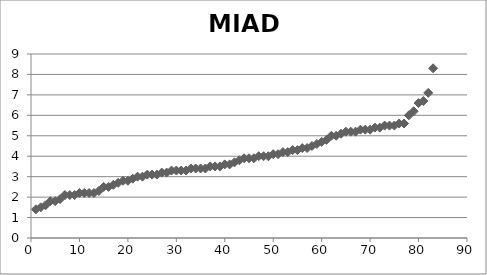
| Category | MIAD |
|---|---|
| 1.0 | 1.4 |
| 2.0 | 1.5 |
| 3.0 | 1.6 |
| 4.0 | 1.8 |
| 5.0 | 1.8 |
| 6.0 | 1.9 |
| 7.0 | 2.1 |
| 8.0 | 2.1 |
| 9.0 | 2.1 |
| 10.0 | 2.2 |
| 11.0 | 2.2 |
| 12.0 | 2.2 |
| 13.0 | 2.2 |
| 14.0 | 2.3 |
| 15.0 | 2.5 |
| 16.0 | 2.5 |
| 17.0 | 2.6 |
| 18.0 | 2.7 |
| 19.0 | 2.8 |
| 20.0 | 2.8 |
| 21.0 | 2.9 |
| 22.0 | 3 |
| 23.0 | 3 |
| 24.0 | 3.1 |
| 25.0 | 3.1 |
| 26.0 | 3.1 |
| 27.0 | 3.2 |
| 28.0 | 3.2 |
| 29.0 | 3.3 |
| 30.0 | 3.3 |
| 31.0 | 3.3 |
| 32.0 | 3.3 |
| 33.0 | 3.4 |
| 34.0 | 3.4 |
| 35.0 | 3.4 |
| 36.0 | 3.4 |
| 37.0 | 3.5 |
| 38.0 | 3.5 |
| 39.0 | 3.5 |
| 40.0 | 3.6 |
| 41.0 | 3.6 |
| 42.0 | 3.7 |
| 43.0 | 3.8 |
| 44.0 | 3.9 |
| 45.0 | 3.9 |
| 46.0 | 3.9 |
| 47.0 | 4 |
| 48.0 | 4 |
| 49.0 | 4 |
| 50.0 | 4.1 |
| 51.0 | 4.1 |
| 52.0 | 4.2 |
| 53.0 | 4.2 |
| 54.0 | 4.3 |
| 55.0 | 4.3 |
| 56.0 | 4.4 |
| 57.0 | 4.4 |
| 58.0 | 4.5 |
| 59.0 | 4.6 |
| 60.0 | 4.7 |
| 61.0 | 4.8 |
| 62.0 | 5 |
| 63.0 | 5 |
| 64.0 | 5.1 |
| 65.0 | 5.2 |
| 66.0 | 5.2 |
| 67.0 | 5.2 |
| 68.0 | 5.3 |
| 69.0 | 5.3 |
| 70.0 | 5.3 |
| 71.0 | 5.4 |
| 72.0 | 5.4 |
| 73.0 | 5.5 |
| 74.0 | 5.5 |
| 75.0 | 5.5 |
| 76.0 | 5.6 |
| 77.0 | 5.6 |
| 78.0 | 6 |
| 79.0 | 6.2 |
| 80.0 | 6.6 |
| 81.0 | 6.7 |
| 82.0 | 7.1 |
| 83.0 | 8.3 |